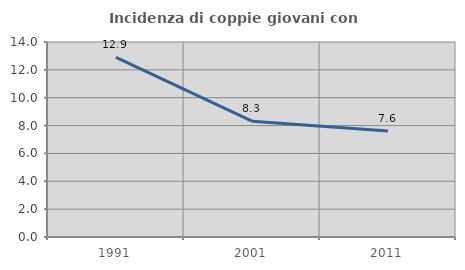
| Category | Incidenza di coppie giovani con figli |
|---|---|
| 1991.0 | 12.903 |
| 2001.0 | 8.317 |
| 2011.0 | 7.602 |